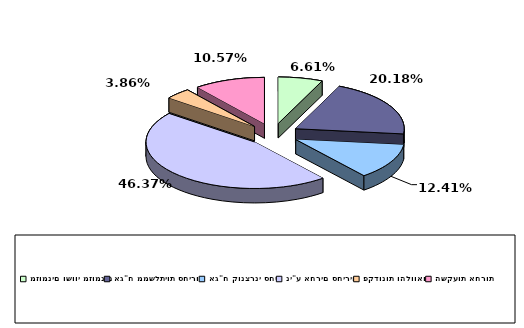
| Category | Series 0 |
|---|---|
| מזומנים ושווי מזומנים | 0.066 |
| אג"ח ממשלתיות סחירות | 0.202 |
| אג"ח קונצרני סחיר | 0.124 |
| ני"ע אחרים סחירים | 0.464 |
| פקדונות והלוואות | 0.039 |
| השקעות אחרות | 0.106 |